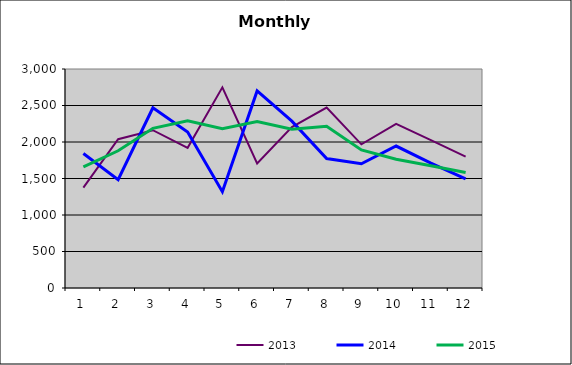
| Category | 2013 | 2014 | 2015 |
|---|---|---|---|
| 0 | 1375.298 | 1842.078 | 1657.754 |
| 1 | 2038.391 | 1484.977 | 1879.407 |
| 2 | 2161.381 | 2467.773 | 2187.56 |
| 3 | 1919.971 | 2136.58 | 2289.062 |
| 4 | 2748.309 | 1319.681 | 2180.641 |
| 5 | 1705.243 | 2699.264 | 2279.935 |
| 6 | 2203.49 | 2286.137 | 2173.858 |
| 7 | 2471.28 | 1773.145 | 2216.295 |
| 8 | 1968.263 | 1701.848 | 1891.474 |
| 9 | 2248.057 | 1944.775 | 1764.175 |
| 10 | 2024.778 | 1710.018 | 1674.726 |
| 11 | 1799.99 | 1495.281 | 1581.133 |